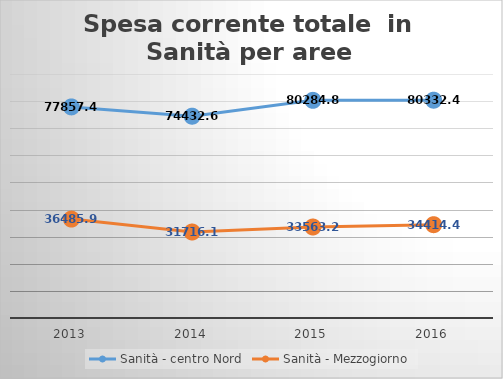
| Category | Sanità - centro Nord | Sanità - Mezzogiorno |
|---|---|---|
| 2013.0 | 77857.49 | 36485.98 |
| 2014.0 | 74432.67 | 31716.14 |
| 2015.0 | 80284.81 | 33563.24 |
| 2016.0 | 80332.488 | 34414.409 |